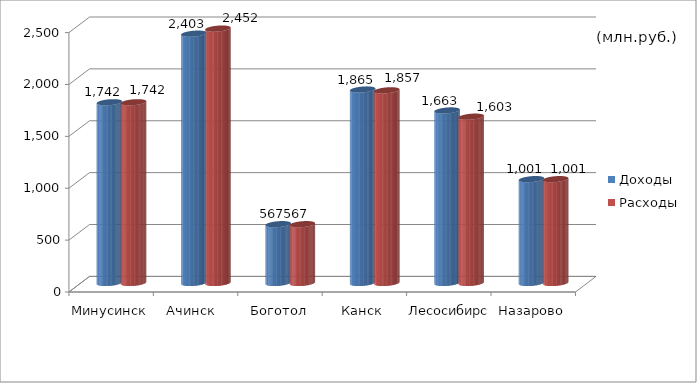
| Category | Доходы | Расходы |
|---|---|---|
| Минусинск | 1742 | 1742 |
| Ачинск  | 2403 | 2452 |
| Боготол | 567 | 567 |
| Канск | 1865 | 1857 |
| Лесосибирск | 1663 | 1603 |
| Назарово | 1001 | 1001 |